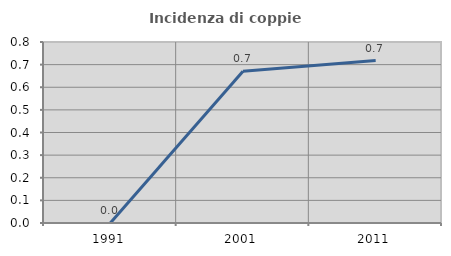
| Category | Incidenza di coppie miste |
|---|---|
| 1991.0 | 0 |
| 2001.0 | 0.671 |
| 2011.0 | 0.718 |